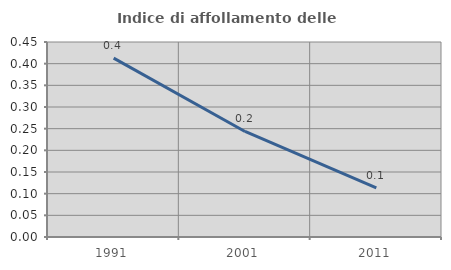
| Category | Indice di affollamento delle abitazioni  |
|---|---|
| 1991.0 | 0.413 |
| 2001.0 | 0.244 |
| 2011.0 | 0.113 |